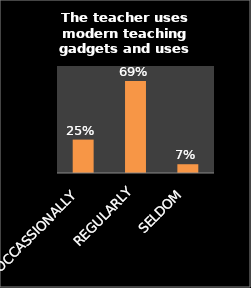
| Category | Series 0 |
|---|---|
| OCCASSIONALLY | 0.25 |
| REGULARLY | 0.688 |
| SELDOM | 0.066 |